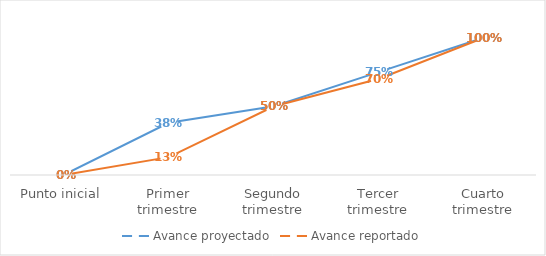
| Category | Avance proyectado | Avance reportado |
|---|---|---|
| Punto inicial | 0 | 0 |
| Primer trimestre | 0.38 | 0.13 |
| Segundo trimestre | 0.5 | 0.5 |
| Tercer trimestre | 0.75 | 0.7 |
| Cuarto trimestre | 1 | 1 |